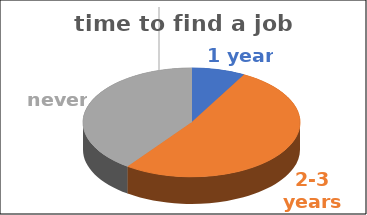
| Category | time to find a job | Series 1 | Series 2 | Series 3 | Series 4 |
|---|---|---|---|---|---|
| 1 year | 0.08 |  |  |  |  |
| 2-3 years | 0.52 |  |  |  |  |
| never | 0.4 |  |  |  |  |